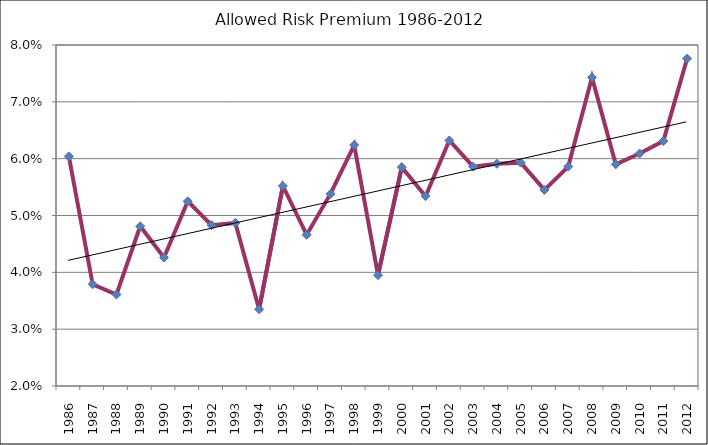
| Category | Series 0 |
|---|---|
| 1986 | 0.06 |
| 1987 | 0.038 |
| 1988 | 0.036 |
| 1989 | 0.048 |
| 1990 | 0.043 |
| 1991 | 0.053 |
| 1992 | 0.048 |
| 1993 | 0.049 |
| 1994 | 0.034 |
| 1995 | 0.055 |
| 1996 | 0.047 |
| 1997 | 0.054 |
| 1998 | 0.062 |
| 1999 | 0.04 |
| 2000 | 0.058 |
| 2001 | 0.053 |
| 2002 | 0.063 |
| 2003 | 0.059 |
| 2004 | 0.059 |
| 2005 | 0.059 |
| 2006 | 0.054 |
| 2007 | 0.059 |
| 2008 | 0.074 |
| 2009 | 0.059 |
| 2010 | 0.061 |
| 2011 | 0.063 |
| 2012 | 0.078 |